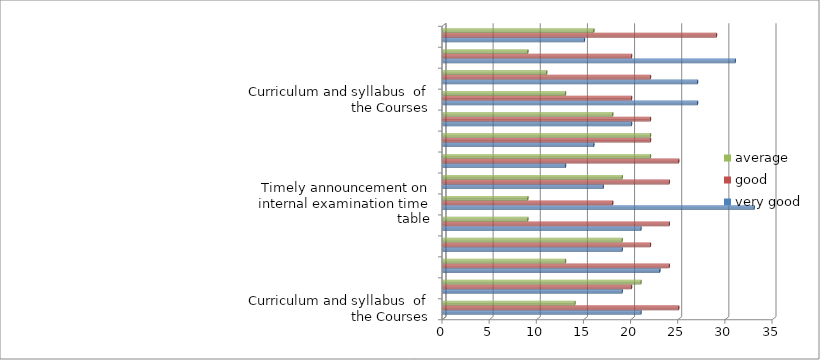
| Category | very good | good | average |
|---|---|---|---|
| Curriculum and syllabus  of the Courses | 21 | 25 | 14 |
| Extent of syllabus covered in the class | 19 | 20 | 21 |
| Courses delivery by faculty members in the class | 23 | 24 | 13 |
| Usage of teaching aids and ICT in the class | 19 | 22 | 19 |
| Fairness in the assessment Process | 21 | 24 | 9 |
| Timely announcement on internal examination time table | 33 | 18 | 9 |
| Opportunities available in the college for best practices/ other activities | 17 | 24 | 19 |
| Opportunities available in the college for students to participate in internship, field visits etc. | 13 | 25 | 22 |
| Opportunities for out of class room learning eg. Guest lectures, Seminars, Workshop Value aided Programmes, Conferences, competitions etc. | 16 | 22 | 22 |
| Overall Learning Experience | 20 | 22 | 18 |
| Curriculum and syllabus  of the Courses | 27 | 20 | 13 |
| Extent of syllabus covered in the class | 27 | 22 | 11 |
| Courses delivery by faculty members in the class | 31 | 20 | 9 |
| Usage of teaching aids and ICT in the class | 15 | 29 | 16 |